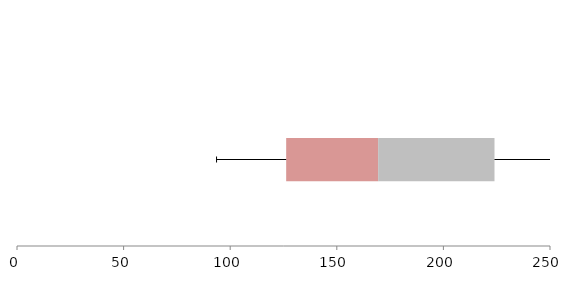
| Category | Series 1 | Series 2 | Series 3 |
|---|---|---|---|
| 0 | 126.254 | 43.142 | 54.568 |